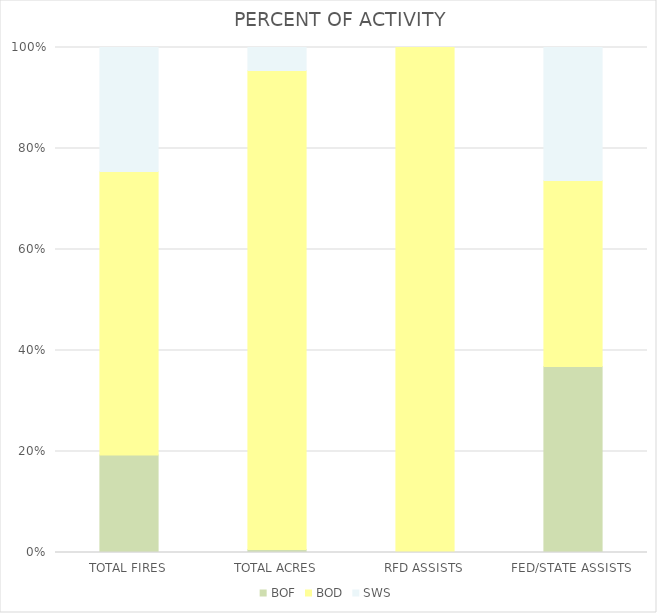
| Category | BOF | BOD | SWS |
|---|---|---|---|
| TOTAL FIRES | 11 | 32 | 14 |
| TOTAL ACRES | 12.15 | 2001.75 | 96.35 |
| RFD ASSISTS | 0 | 6 | 0 |
| FED/STATE ASSISTS | 7 | 7 | 5 |